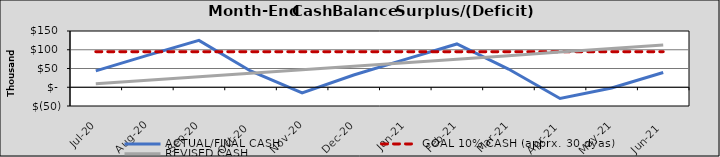
| Category | ACTUAL/FINAL CASH | GOAL 10% CASH (apprx. 30 dyas) | REVISED CASH |
|---|---|---|---|
| 2020-07-01 | 43807.069 | 94883.883 | 9368.558 |
| 2020-08-01 | 85101.514 | 94883.883 | 18737.117 |
| 2020-09-01 | 124863.778 | 94883.883 | 28105.675 |
| 2020-10-02 | 43514.667 | 94883.883 | 37474.233 |
| 2020-11-02 | -15298.264 | 94883.883 | 46842.792 |
| 2020-12-03 | 32667.931 | 94883.883 | 56211.35 |
| 2021-01-03 | 74312.375 | 94883.883 | 65579.908 |
| 2021-02-03 | 115485.514 | 94883.883 | 74948.467 |
| 2021-03-06 | 48506.584 | 94883.883 | 84317.025 |
| 2021-04-06 | -29906.347 | 94883.883 | 93685.583 |
| 2021-05-07 | -2119.278 | 94883.883 | 103054.142 |
| 2021-06-07 | 39381.874 | 94883.883 | 112422.7 |